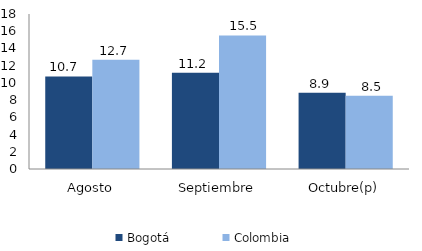
| Category | Bogotá | Colombia |
|---|---|---|
| Agosto | 10.745 | 12.683 |
| Septiembre | 11.175 | 15.507 |
| Octubre(p) | 8.861 | 8.514 |